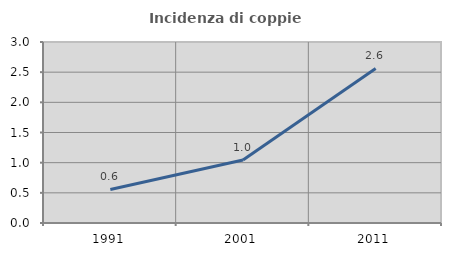
| Category | Incidenza di coppie miste |
|---|---|
| 1991.0 | 0.556 |
| 2001.0 | 1.044 |
| 2011.0 | 2.561 |